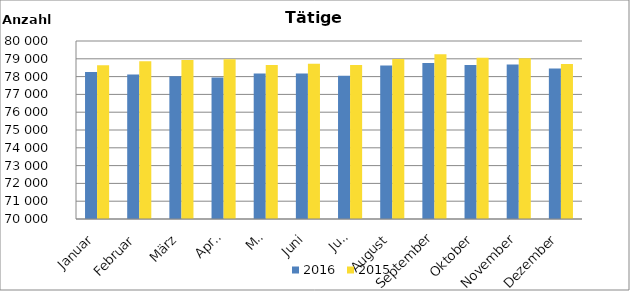
| Category | 2016 | 2015 |
|---|---|---|
| Januar | 78254 | 78641 |
| Februar | 78113 | 78867 |
| März | 78023 | 78936 |
| April | 77945 | 78980 |
| Mai | 78168 | 78658 |
| Juni | 78176 | 78722 |
| Juli | 78050 | 78654 |
| August | 78629 | 78993 |
| September | 78758 | 79261 |
| Oktober | 78656 | 79058 |
| November | 78681 | 79025 |
| Dezember | 78459 | 78712 |